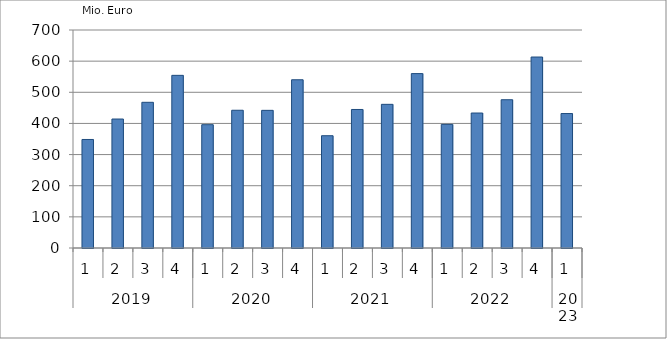
| Category | Ausbaugewerblicher Umsatz3 |
|---|---|
| 0 | 348466.115 |
| 1 | 414145.554 |
| 2 | 467849.207 |
| 3 | 554369.34 |
| 4 | 395996.128 |
| 5 | 442270.528 |
| 6 | 441987.109 |
| 7 | 540250.513 |
| 8 | 360578.959 |
| 9 | 444796.964 |
| 10 | 461290.095 |
| 11 | 559989.337 |
| 12 | 396959.135 |
| 13 | 433420.546 |
| 14 | 476099.112 |
| 15 | 613244.901 |
| 16 | 431755.233 |